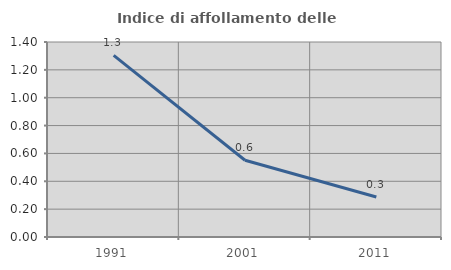
| Category | Indice di affollamento delle abitazioni  |
|---|---|
| 1991.0 | 1.304 |
| 2001.0 | 0.551 |
| 2011.0 | 0.287 |